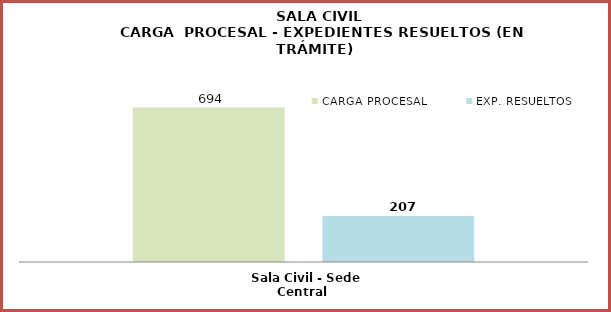
| Category | CARGA PROCESAL | EXP. RESUELTOS |
|---|---|---|
| Sala Civil - Sede Central | 694 | 207 |